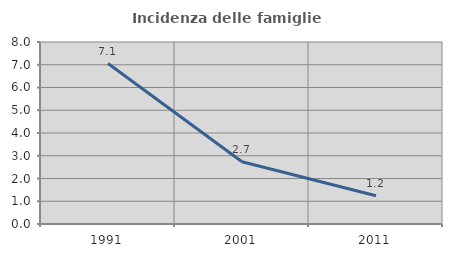
| Category | Incidenza delle famiglie numerose |
|---|---|
| 1991.0 | 7.054 |
| 2001.0 | 2.738 |
| 2011.0 | 1.244 |